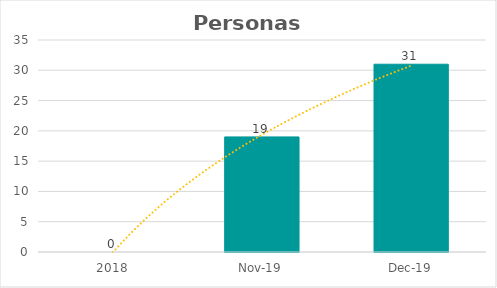
| Category | Series 0 |
|---|---|
| 2018.0 | 0 |
| 43770.0 | 19 |
| 43800.0 | 31 |